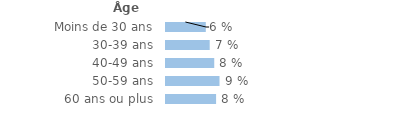
| Category | Series 0 |
|---|---|
| Moins de 30 ans | 0.064 |
| 30-39 ans | 0.07 |
| 40-49 ans | 0.078 |
| 50-59 ans | 0.086 |
| 60 ans ou plus | 0.081 |